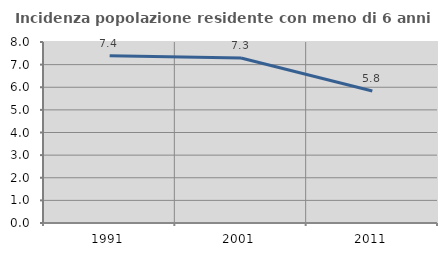
| Category | Incidenza popolazione residente con meno di 6 anni |
|---|---|
| 1991.0 | 7.397 |
| 2001.0 | 7.293 |
| 2011.0 | 5.836 |